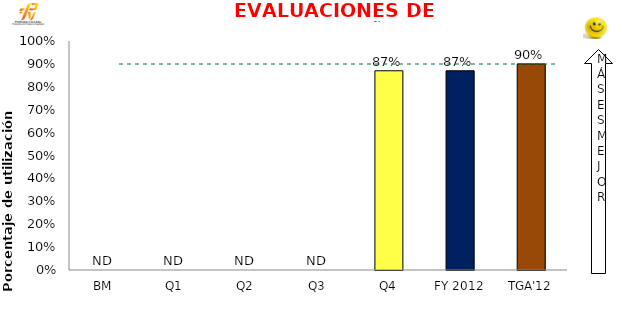
| Category | Mensual |
|---|---|
| BM | 0 |
| Q1 | 0 |
| Q2 | 0 |
| Q3 | 0 |
| Q4 | 0.87 |
| FY 2012 | 0.87 |
| TGA'12 | 0.9 |